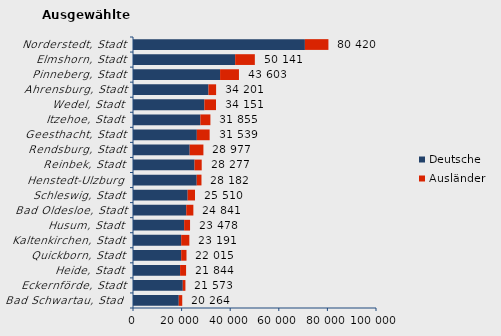
| Category | Deutsche | Ausländer | Series 2 |
|---|---|---|---|
| Bad Schwartau, Stadt | 18835 | 1429 | 20264 |
| Eckernförde, Stadt | 20492 | 1081 | 21573 |
| Heide, Stadt | 19379 | 2465 | 21844 |
| Quickborn, Stadt | 19829 | 2186 | 22015 |
| Kaltenkirchen, Stadt | 19831 | 3360 | 23191 |
| Husum, Stadt | 21052 | 2426 | 23478 |
| Bad Oldesloe, Stadt | 21910 | 2931 | 24841 |
| Schleswig, Stadt | 22496 | 3014 | 25510 |
| Henstedt-Ulzburg | 26222 | 1960 | 28182 |
| Reinbek, Stadt | 25319 | 2958 | 28277 |
| Rendsburg, Stadt | 23331 | 5646 | 28977 |
| Geesthacht, Stadt | 26267 | 5272 | 31539 |
| Itzehoe, Stadt | 27742 | 4113 | 31855 |
| Wedel, Stadt | 29373 | 4778 | 34151 |
| Ahrensburg, Stadt | 31061 | 3140 | 34201 |
| Pinneberg, Stadt | 35834 | 7769 | 43603 |
| Elmshorn, Stadt | 42034 | 8107 | 50141 |
| Norderstedt, Stadt | 70737 | 9683 | 80420 |